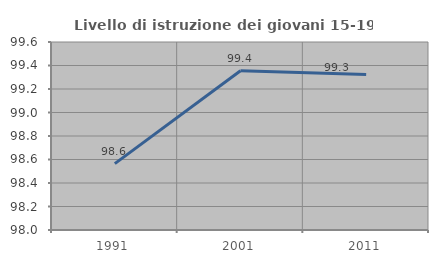
| Category | Livello di istruzione dei giovani 15-19 anni |
|---|---|
| 1991.0 | 98.565 |
| 2001.0 | 99.355 |
| 2011.0 | 99.324 |